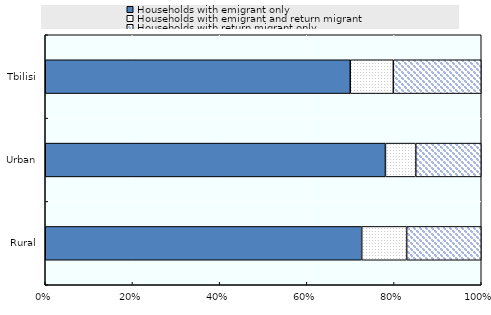
| Category | Households with emigrant only | Households with emigrant and return migrant | Households with return migrant only |
|---|---|---|---|
| Rural | 331 | 47 | 78 |
| Urban | 213 | 19 | 41 |
| Tbilisi | 170 | 24 | 49 |